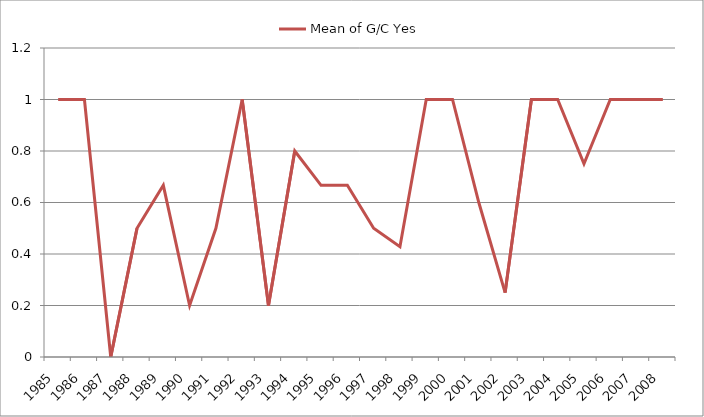
| Category | Mean of G/C Yes |
|---|---|
| 1985.0 | 1 |
| 1986.0 | 1 |
| 1987.0 | 0 |
| 1988.0 | 0.5 |
| 1989.0 | 0.667 |
| 1990.0 | 0.2 |
| 1991.0 | 0.5 |
| 1992.0 | 1 |
| 1993.0 | 0.2 |
| 1994.0 | 0.8 |
| 1995.0 | 0.667 |
| 1996.0 | 0.667 |
| 1997.0 | 0.5 |
| 1998.0 | 0.429 |
| 1999.0 | 1 |
| 2000.0 | 1 |
| 2001.0 | 0.6 |
| 2002.0 | 0.25 |
| 2003.0 | 1 |
| 2004.0 | 1 |
| 2005.0 | 0.75 |
| 2006.0 | 1 |
| 2007.0 | 1 |
| 2008.0 | 1 |